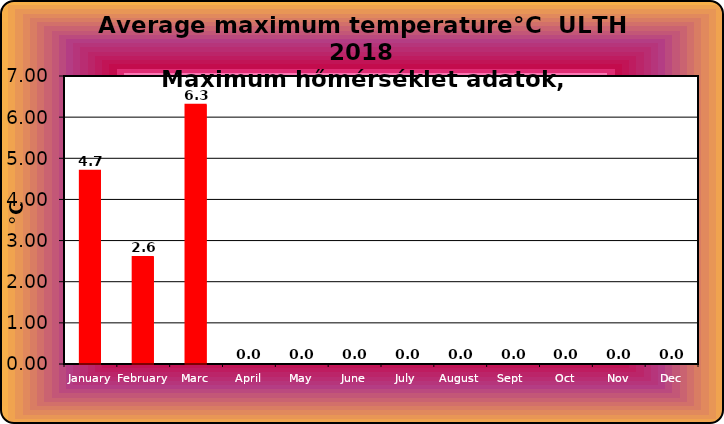
| Category | Series 0 |
|---|---|
| January | 4.7 |
| February | 2.6 |
| Marc | 6.3 |
| April | 0 |
| May | 0 |
| June | 0 |
| July | 0 |
| August | 0 |
| Sept  | 0 |
| Oct | 0 |
| Nov | 0 |
| Dec | 0 |